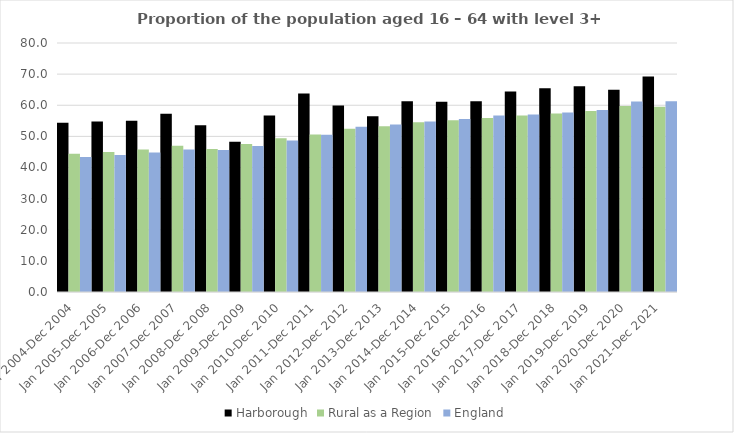
| Category | Harborough | Rural as a Region | England |
|---|---|---|---|
| Jan 2004-Dec 2004 | 54.4 | 44.405 | 43.4 |
| Jan 2005-Dec 2005 | 54.8 | 44.973 | 44 |
| Jan 2006-Dec 2006 | 55 | 45.774 | 44.8 |
| Jan 2007-Dec 2007 | 57.3 | 46.968 | 45.8 |
| Jan 2008-Dec 2008 | 53.6 | 45.964 | 45.6 |
| Jan 2009-Dec 2009 | 48.3 | 47.59 | 46.9 |
| Jan 2010-Dec 2010 | 56.7 | 49.362 | 48.7 |
| Jan 2011-Dec 2011 | 63.8 | 50.602 | 50.5 |
| Jan 2012-Dec 2012 | 59.9 | 52.439 | 53.1 |
| Jan 2013-Dec 2013 | 56.5 | 53.276 | 53.8 |
| Jan 2014-Dec 2014 | 61.3 | 54.57 | 54.8 |
| Jan 2015-Dec 2015 | 61.1 | 55.16 | 55.6 |
| Jan 2016-Dec 2016 | 61.3 | 55.941 | 56.7 |
| Jan 2017-Dec 2017 | 64.4 | 56.689 | 57 |
| Jan 2018-Dec 2018 | 65.5 | 57.389 | 57.7 |
| Jan 2019-Dec 2019 | 66.1 | 58.147 | 58.5 |
| Jan 2020-Dec 2020 | 65 | 59.771 | 61.2 |
| Jan 2021-Dec 2021 | 69.2 | 59.54 | 61.3 |